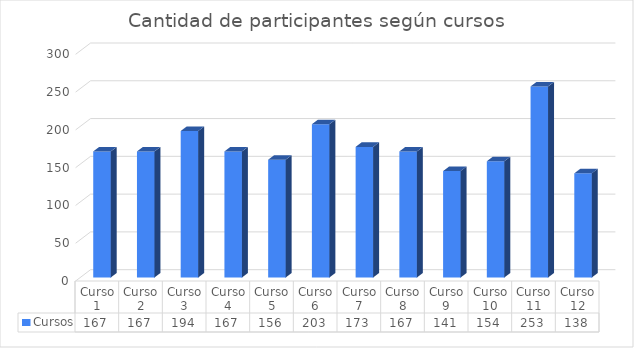
| Category | Cursos |
|---|---|
| Curso 1 | 167 |
| Curso 2 | 167 |
| Curso 3 | 194 |
| Curso 4 | 167 |
| Curso 5 | 156 |
| Curso 6 | 203 |
| Curso 7 | 173 |
| Curso 8 | 167 |
| Curso 9 | 141 |
| Curso 10 | 154 |
| Curso 11 | 253 |
| Curso 12 | 138 |